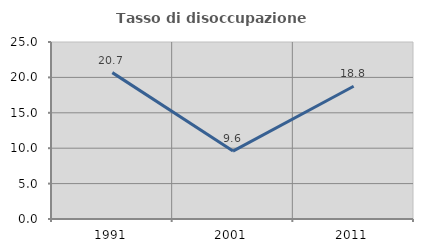
| Category | Tasso di disoccupazione giovanile  |
|---|---|
| 1991.0 | 20.675 |
| 2001.0 | 9.589 |
| 2011.0 | 18.75 |